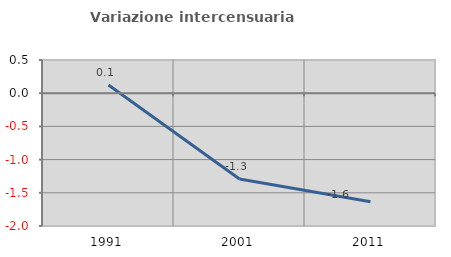
| Category | Variazione intercensuaria annua |
|---|---|
| 1991.0 | 0.124 |
| 2001.0 | -1.291 |
| 2011.0 | -1.636 |